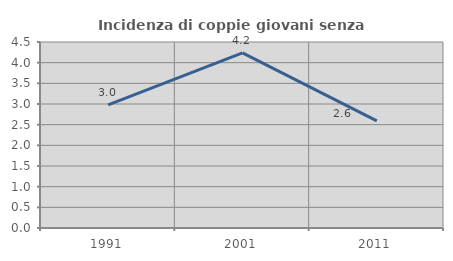
| Category | Incidenza di coppie giovani senza figli |
|---|---|
| 1991.0 | 2.98 |
| 2001.0 | 4.237 |
| 2011.0 | 2.594 |